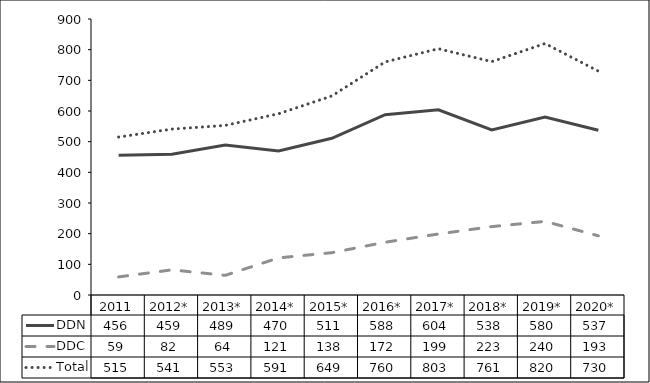
| Category | DDN | DDC | Total |
|---|---|---|---|
| 2011 | 456 | 59 | 515 |
| 2012* | 459 | 82 | 541 |
| 2013* | 489 | 64 | 553 |
| 2014* | 470 | 121 | 591 |
| 2015* | 511 | 138 | 649 |
| 2016* | 588 | 172 | 760 |
| 2017* | 604 | 199 | 803 |
| 2018* | 538 | 223 | 761 |
| 2019* | 580 | 240 | 820 |
| 2020* | 537 | 193 | 730 |